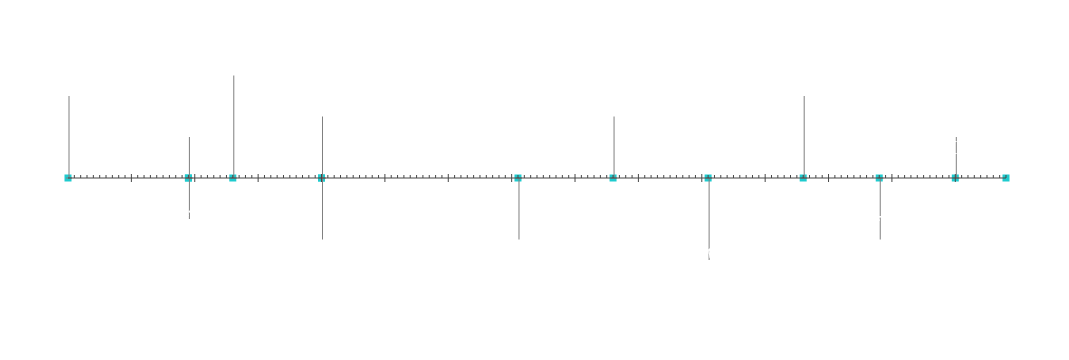
| Category | Sijoitus |
|---|---|
| Projektin alku | 20 |
| Välitavoite 1 | 10 |
| Välitavoite 2 | -10 |
| Välitavoite 3 | 25 |
| Välitavoite 4 | -15 |
| Välitavoite 5 | 15 |
| Välitavoite 6 | -15 |
| Välitavoite 7 | 15 |
| Välitavoite 8 | -20 |
| Välitavoite 9 | 20 |
| Välitavoite 10 | -15 |
| Välitavoite 11 | 10 |
| Projektin loppu | 5 |